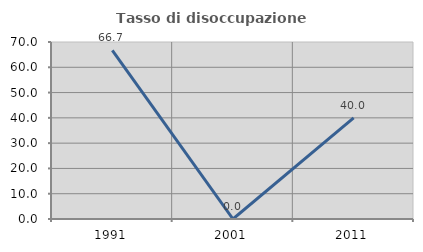
| Category | Tasso di disoccupazione giovanile  |
|---|---|
| 1991.0 | 66.667 |
| 2001.0 | 0 |
| 2011.0 | 40 |